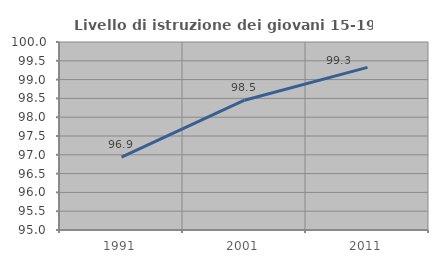
| Category | Livello di istruzione dei giovani 15-19 anni |
|---|---|
| 1991.0 | 96.937 |
| 2001.0 | 98.451 |
| 2011.0 | 99.324 |